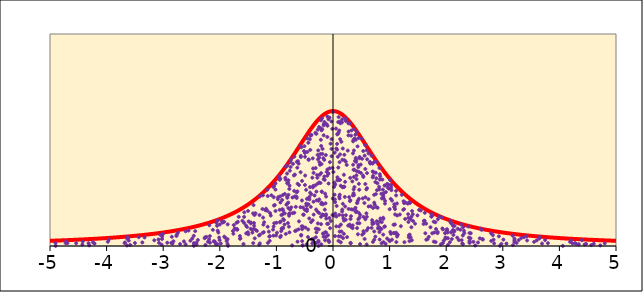
| Category | density function |
|---|---|
| -5.0 | 0.012 |
| -4.9 | 0.013 |
| -4.8 | 0.013 |
| -4.7 | 0.014 |
| -4.6 | 0.014 |
| -4.5 | 0.015 |
| -4.4 | 0.016 |
| -4.3 | 0.016 |
| -4.2 | 0.017 |
| -4.1 | 0.018 |
| -4.0 | 0.019 |
| -3.9 | 0.02 |
| -3.8 | 0.021 |
| -3.7 | 0.022 |
| -3.6 | 0.023 |
| -3.50000000000001 | 0.024 |
| -3.40000000000001 | 0.025 |
| -3.30000000000001 | 0.027 |
| -3.20000000000001 | 0.028 |
| -3.10000000000001 | 0.03 |
| -3.00000000000001 | 0.032 |
| -2.90000000000001 | 0.034 |
| -2.80000000000001 | 0.036 |
| -2.70000000000001 | 0.038 |
| -2.60000000000001 | 0.041 |
| -2.50000000000001 | 0.044 |
| -2.40000000000001 | 0.047 |
| -2.30000000000001 | 0.051 |
| -2.20000000000001 | 0.055 |
| -2.10000000000001 | 0.059 |
| -2.00000000000001 | 0.064 |
| -1.90000000000001 | 0.069 |
| -1.80000000000001 | 0.075 |
| -1.70000000000001 | 0.082 |
| -1.60000000000001 | 0.089 |
| -1.50000000000001 | 0.098 |
| -1.40000000000001 | 0.108 |
| -1.30000000000001 | 0.118 |
| -1.20000000000001 | 0.13 |
| -1.10000000000001 | 0.144 |
| -1.00000000000001 | 0.159 |
| -0.90000000000001 | 0.176 |
| -0.80000000000001 | 0.194 |
| -0.70000000000002 | 0.214 |
| -0.60000000000002 | 0.234 |
| -0.50000000000002 | 0.255 |
| -0.40000000000002 | 0.274 |
| -0.30000000000002 | 0.292 |
| -0.20000000000002 | 0.306 |
| -0.10000000000002 | 0.315 |
| -2.04281036531029e-14 | 0.318 |
| 0.0999999999999801 | 0.315 |
| 0.19999999999998 | 0.306 |
| 0.29999999999998 | 0.292 |
| 0.39999999999998 | 0.274 |
| 0.49999999999998 | 0.255 |
| 0.59999999999998 | 0.234 |
| 0.69999999999998 | 0.214 |
| 0.79999999999998 | 0.194 |
| 0.89999999999998 | 0.176 |
| 0.99999999999998 | 0.159 |
| 1.09999999999998 | 0.144 |
| 1.19999999999998 | 0.13 |
| 1.29999999999998 | 0.118 |
| 1.39999999999998 | 0.108 |
| 1.49999999999998 | 0.098 |
| 1.59999999999998 | 0.089 |
| 1.69999999999998 | 0.082 |
| 1.79999999999998 | 0.075 |
| 1.89999999999998 | 0.069 |
| 1.99999999999998 | 0.064 |
| 2.09999999999997 | 0.059 |
| 2.19999999999997 | 0.055 |
| 2.29999999999997 | 0.051 |
| 2.39999999999997 | 0.047 |
| 2.49999999999997 | 0.044 |
| 2.59999999999997 | 0.041 |
| 2.69999999999997 | 0.038 |
| 2.79999999999997 | 0.036 |
| 2.89999999999997 | 0.034 |
| 2.99999999999997 | 0.032 |
| 3.09999999999997 | 0.03 |
| 3.19999999999997 | 0.028 |
| 3.29999999999997 | 0.027 |
| 3.39999999999997 | 0.025 |
| 3.49999999999997 | 0.024 |
| 3.59999999999997 | 0.023 |
| 3.69999999999997 | 0.022 |
| 3.79999999999997 | 0.021 |
| 3.89999999999997 | 0.02 |
| 3.99999999999997 | 0.019 |
| 4.09999999999997 | 0.018 |
| 4.19999999999997 | 0.017 |
| 4.29999999999997 | 0.016 |
| 4.39999999999997 | 0.016 |
| 4.49999999999997 | 0.015 |
| 4.59999999999997 | 0.014 |
| 4.69999999999997 | 0.014 |
| 4.79999999999997 | 0.013 |
| 4.89999999999996 | 0.013 |
| 4.99999999999996 | 0.012 |